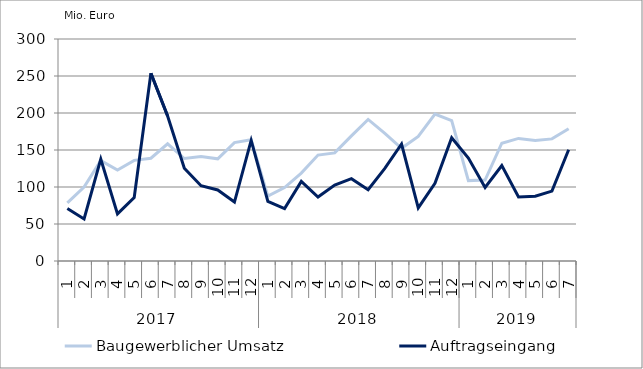
| Category | Baugewerblicher Umsatz | Auftragseingang |
|---|---|---|
| 0 | 78446.78 | 70908.903 |
| 1 | 99841.908 | 56868.408 |
| 2 | 135679.867 | 137790.423 |
| 3 | 123004.403 | 63637.761 |
| 4 | 136010.071 | 85644.63 |
| 5 | 138859.308 | 253791.552 |
| 6 | 158353.879 | 196034.198 |
| 7 | 138510.315 | 125319.873 |
| 8 | 141109.925 | 101690.626 |
| 9 | 138067.098 | 95966.626 |
| 10 | 160064.454 | 79701.993 |
| 11 | 163969.017 | 162878.607 |
| 12 | 87640.529 | 80684.627 |
| 13 | 99259.455 | 70746.763 |
| 14 | 118764.324 | 107538.747 |
| 15 | 143144.178 | 86374.619 |
| 16 | 146070.782 | 102661.329 |
| 17 | 169150.753 | 111287.709 |
| 18 | 191277.885 | 96286.662 |
| 19 | 172425.535 | 125142.495 |
| 20 | 152354.98 | 158112.302 |
| 21 | 168372.756 | 71808.619 |
| 22 | 198558.472 | 104904.147 |
| 23 | 189665.914 | 166653.461 |
| 24 | 108616.605 | 139065.287 |
| 25 | 109331.58 | 99318.609 |
| 26 | 159117.81 | 129002.041 |
| 27 | 165654.287 | 86579.2 |
| 28 | 162976.056 | 87644.362 |
| 29 | 165026.188 | 94463.186 |
| 30 | 178622.938 | 150345.08 |